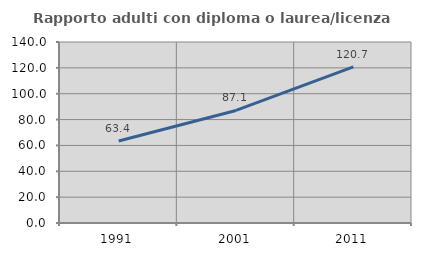
| Category | Rapporto adulti con diploma o laurea/licenza media  |
|---|---|
| 1991.0 | 63.423 |
| 2001.0 | 87.051 |
| 2011.0 | 120.705 |